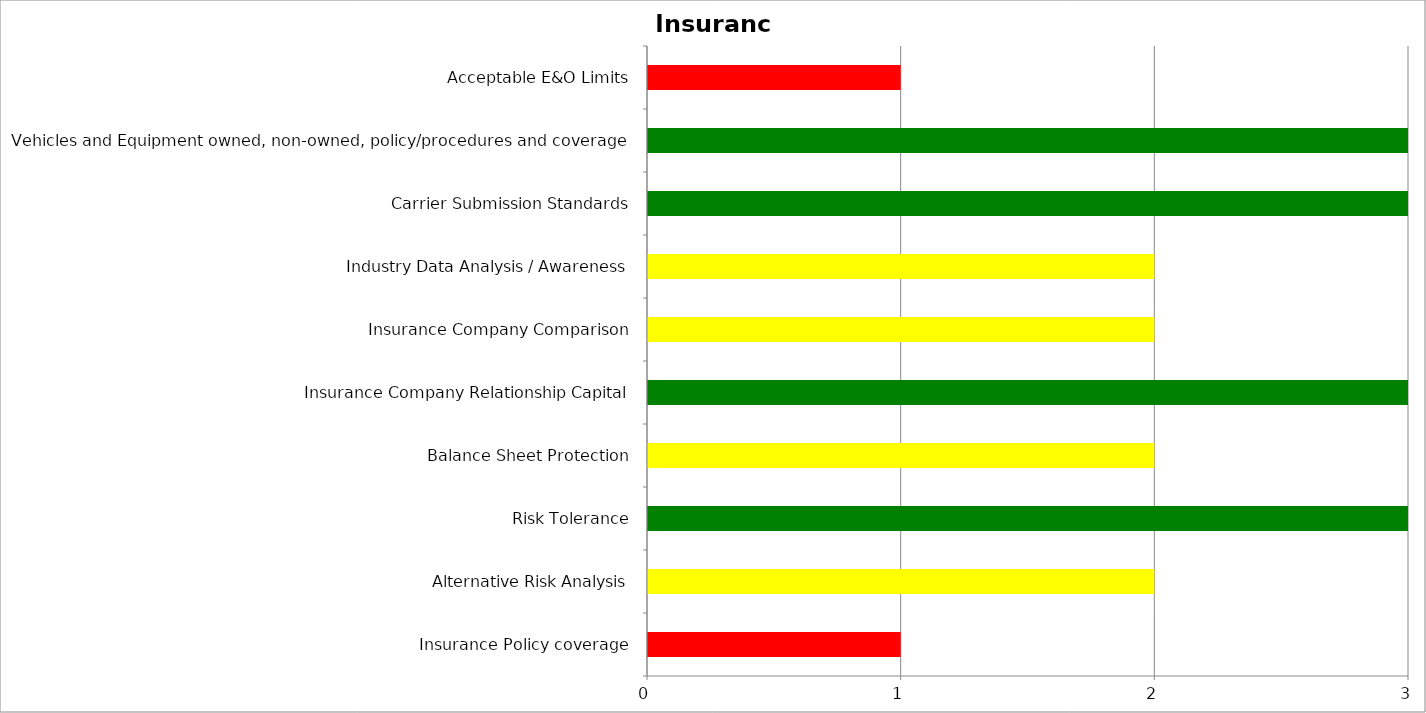
| Category | Low | Medium | High |
|---|---|---|---|
| Insurance Policy coverage | 0 | 0 | 1 |
| Alternative Risk Analysis | 0 | 2 | 0 |
| Risk Tolerance | 3 | 0 | 0 |
| Balance Sheet Protection | 0 | 2 | 0 |
| Insurance Company Relationship Capital | 3 | 0 | 0 |
| Insurance Company Comparison | 0 | 2 | 0 |
| Industry Data Analysis / Awareness | 0 | 2 | 0 |
| Carrier Submission Standards | 3 | 0 | 0 |
| Vehicles and Equipment owned, non-owned, policy/procedures and coverage | 3 | 0 | 0 |
| Acceptable E&O Limits | 0 | 0 | 1 |